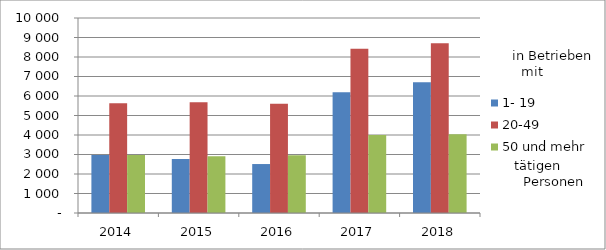
| Category | 1- 19 | 20-49 | 50 und mehr |
|---|---|---|---|
| 2014.0 | 2973 | 5631 | 2973 |
| 2015.0 | 2771 | 5678 | 2913 |
| 2016.0 | 2511 | 5598 | 2967 |
| 2017.0 | 6188 | 8425 | 4004 |
| 2018.0 | 6705 | 8702 | 4036 |